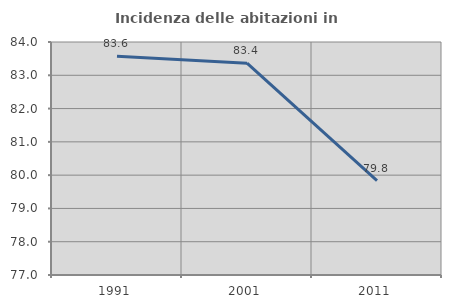
| Category | Incidenza delle abitazioni in proprietà  |
|---|---|
| 1991.0 | 83.57 |
| 2001.0 | 83.362 |
| 2011.0 | 79.835 |